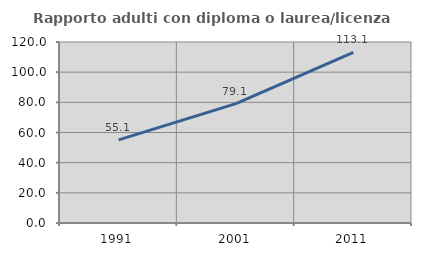
| Category | Rapporto adulti con diploma o laurea/licenza media  |
|---|---|
| 1991.0 | 55.102 |
| 2001.0 | 79.104 |
| 2011.0 | 113.115 |